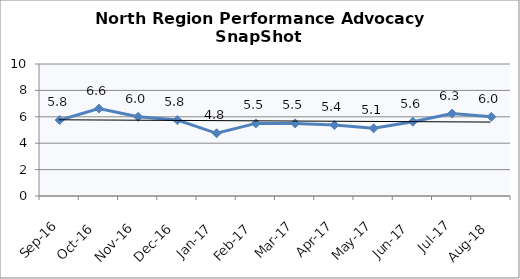
| Category | North Region |
|---|---|
| Sep-16 | 5.75 |
| Oct-16 | 6.625 |
| Nov-16 | 6 |
| Dec-16 | 5.75 |
| Jan-17 | 4.75 |
| Feb-17 | 5.5 |
| Mar-17 | 5.5 |
| Apr-17 | 5.375 |
| May-17 | 5.125 |
| Jun-17 | 5.625 |
| Jul-17 | 6.25 |
| Aug-18 | 6 |